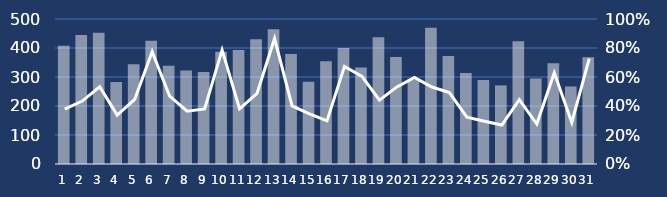
| Category | Contacts |
|---|---|
| 1.0 | 408 |
| 2.0 | 445 |
| 3.0 | 453 |
| 4.0 | 283 |
| 5.0 | 344 |
| 6.0 | 425 |
| 7.0 | 339 |
| 8.0 | 322 |
| 9.0 | 317 |
| 10.0 | 387 |
| 11.0 | 393 |
| 12.0 | 430 |
| 13.0 | 465 |
| 14.0 | 379 |
| 15.0 | 284 |
| 16.0 | 354 |
| 17.0 | 400 |
| 18.0 | 333 |
| 19.0 | 437 |
| 20.0 | 369 |
| 21.0 | 291 |
| 22.0 | 470 |
| 23.0 | 372 |
| 24.0 | 314 |
| 25.0 | 290 |
| 26.0 | 271 |
| 27.0 | 423 |
| 28.0 | 295 |
| 29.0 | 347 |
| 30.0 | 267 |
| 31.0 | 368 |